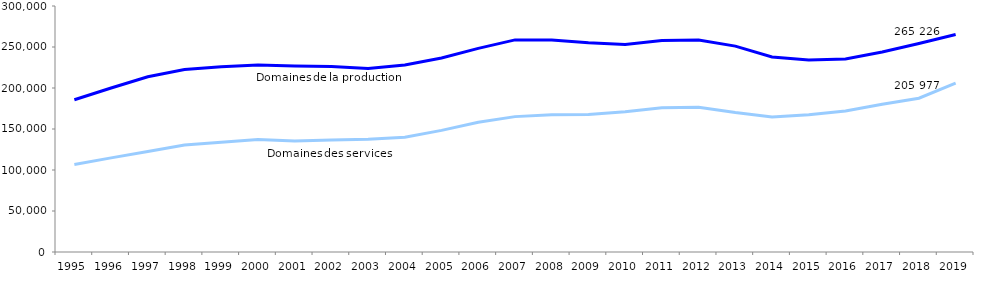
| Category | Domaines de la production | Domaines des services |
|---|---|---|
| 1995 | 185682 | 106784 |
| 1996 | 199995 | 114764 |
| 1997 | 213773 | 122488 |
| 1998 | 222570 | 130580 |
| 1999 | 225802 | 133903 |
| 2000 | 228114 | 137157 |
| 2001 | 226833 | 135458 |
| 2002 | 226307 | 136500 |
| 2003 | 223752 | 137457 |
| 2004 | 228140 | 140059 |
| 2005 | 236666 | 148351 |
| 2006 | 248317 | 158290 |
| 2007 | 258687 | 165089 |
| 2008 | 258550 | 167433 |
| 2009 | 255075 | 167790 |
| 2010 | 252983 | 171022 |
| 2011 | 257900 | 175823 |
| 2012 | 258548 | 176642 |
| 2013 | 251095 | 170059 |
| 2014 | 237932 | 164511 |
| 2015 | 234110 | 167257 |
| 2016 | 235325 | 172057 |
| 2017 | 243845 | 180262 |
| 2018 | 254193 | 187562 |
| 2019 | 265226 | 205977 |